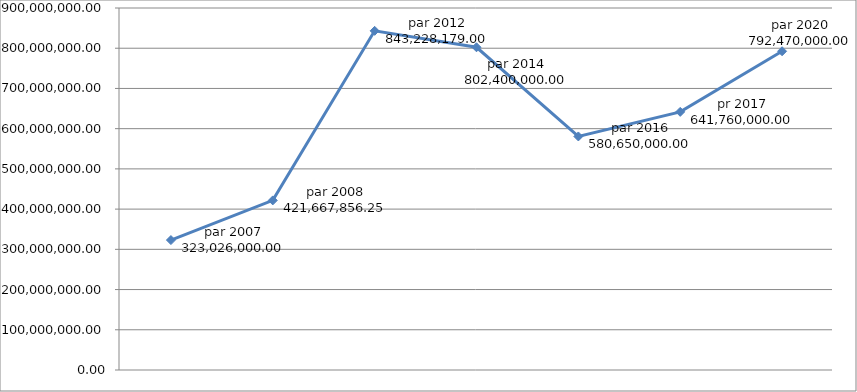
| Category | Series 0 |
|---|---|
| par 2007 | 323026000 |
| par 2008 | 421667856.25 |
| par 2012 | 843228179 |
| par 2014 | 802400000 |
| par 2016 | 580650000 |
| pr 2017 | 641760000 |
| par 2020 | 792470000 |